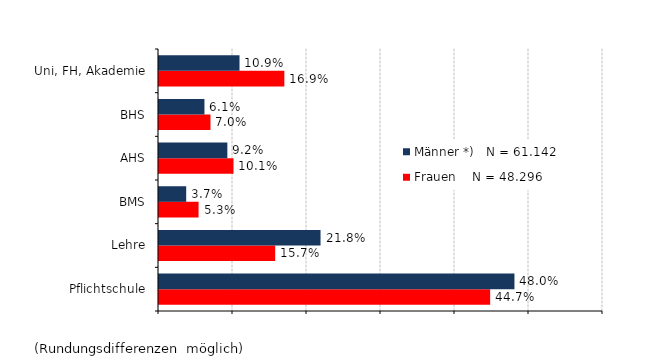
| Category | Frauen    N = 48.296 | Männer *)   N = 61.142 |
|---|---|---|
| Pflichtschule | 0.447 | 0.48 |
| Lehre | 0.157 | 0.218 |
| BMS | 0.053 | 0.037 |
| AHS | 0.101 | 0.092 |
| BHS | 0.07 | 0.061 |
| Uni, FH, Akademie | 0.169 | 0.109 |